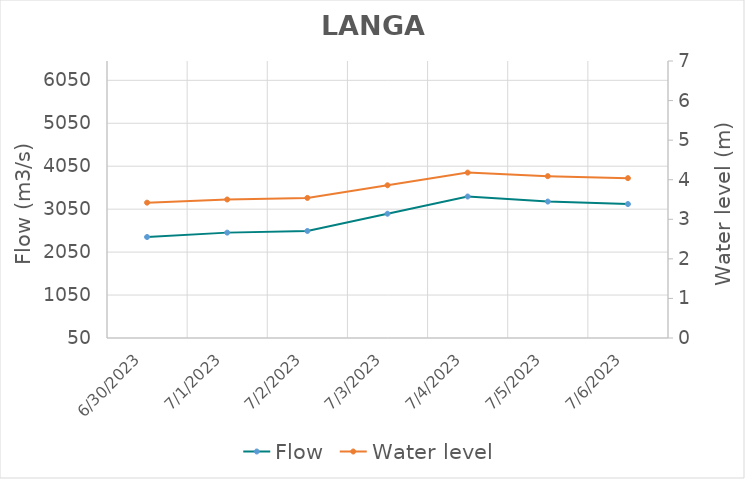
| Category | Flow |
|---|---|
| 4/26/22 | 6357.44 |
| 4/25/22 | 6275.1 |
| 4/24/22 | 6196.88 |
| 4/23/22 | 5912.5 |
| 4/22/22 | 5801.88 |
| 4/21/22 | 4763.75 |
| 4/20/22 | 4718.96 |